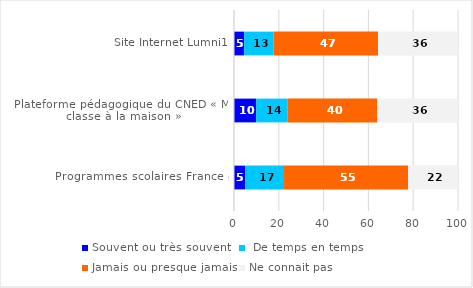
| Category | Souvent ou très souvent |  De temps en temps  | Jamais ou presque jamais | Ne connait pas |
|---|---|---|---|---|
| Site Internet Lumni1 | 4.54 | 13.18 | 46.6 | 35.65 |
| Plateforme pédagogique du CNED « Ma classe à la maison » | 9.88 | 14.12 | 40.01 | 35.94 |
| Programmes scolaires France 4 | 5.07 | 17.27 | 55.35 | 22.29 |